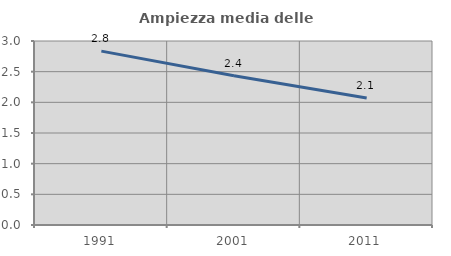
| Category | Ampiezza media delle famiglie |
|---|---|
| 1991.0 | 2.835 |
| 2001.0 | 2.432 |
| 2011.0 | 2.071 |